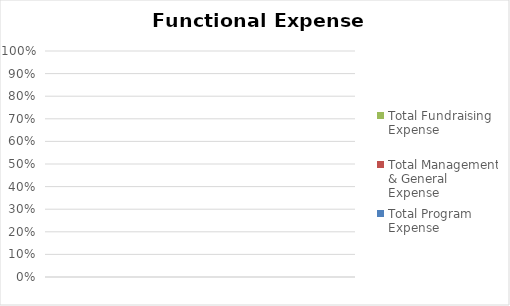
| Category | Total Program Expense | Total Management & General Expense | Total Fundraising Expense |
|---|---|---|---|
|  | 0 | 0 | 0 |
|  | 0 | 0 | 0 |
|  | 0 | 0 | 0 |
|  | 0 | 0 | 0 |